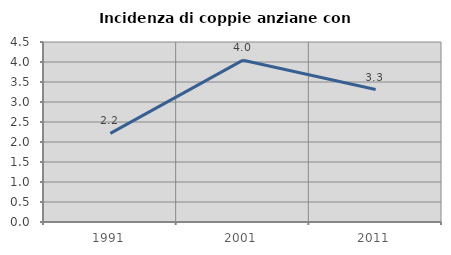
| Category | Incidenza di coppie anziane con figli |
|---|---|
| 1991.0 | 2.217 |
| 2001.0 | 4.046 |
| 2011.0 | 3.312 |